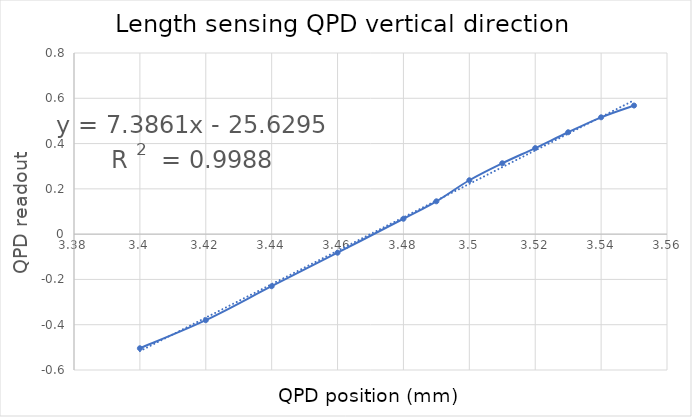
| Category | Series 0 |
|---|---|
| 3.4 | -0.504 |
| 3.42 | -0.38 |
| 3.44 | -0.23 |
| 3.46 | -0.082 |
| 3.48 | 0.068 |
| 3.49 | 0.145 |
| 3.5 | 0.238 |
| 3.51 | 0.313 |
| 3.52 | 0.38 |
| 3.53 | 0.45 |
| 3.54 | 0.516 |
| 3.55 | 0.568 |